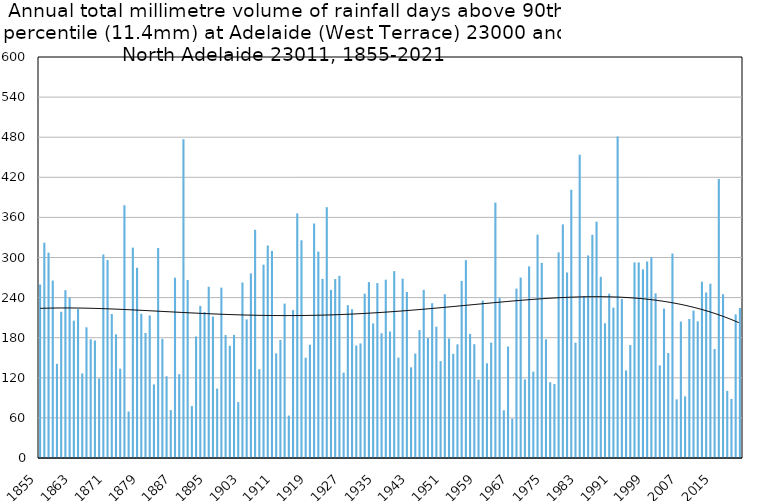
| Category | Annual total mm in days above 90th percentile |
|---|---|
| 1855 | 259.6 |
| 1856 | 322.1 |
| 1857 | 307.2 |
| 1858 | 265.5 |
| 1859 | 140.9 |
| 1860 | 218.8 |
| 1861 | 251.1 |
| 1862 | 240.2 |
| 1863 | 205.4 |
| 1864 | 222.8 |
| 1865 | 126.5 |
| 1866 | 195.6 |
| 1867 | 177.7 |
| 1868 | 175.8 |
| 1869 | 118.9 |
| 1870 | 304.5 |
| 1871 | 296.2 |
| 1872 | 215.5 |
| 1873 | 185 |
| 1874 | 133.7 |
| 1875 | 378.2 |
| 1876 | 69.6 |
| 1877 | 314.8 |
| 1878 | 284.6 |
| 1879 | 215.8 |
| 1880 | 187.1 |
| 1881 | 213.3 |
| 1882 | 110.1 |
| 1883 | 314.3 |
| 1884 | 178.3 |
| 1885 | 122.3 |
| 1886 | 71.6 |
| 1887 | 269.8 |
| 1888 | 125.4 |
| 1889 | 477 |
| 1890 | 266.3 |
| 1891 | 77.7 |
| 1892 | 181.9 |
| 1893 | 227.6 |
| 1894 | 218.4 |
| 1895 | 256.2 |
| 1896 | 211.6 |
| 1897 | 103.9 |
| 1898 | 254.9 |
| 1899 | 183.9 |
| 1900 | 167.9 |
| 1901 | 184.2 |
| 1902 | 83.6 |
| 1903 | 262.6 |
| 1904 | 207.3 |
| 1905 | 276.2 |
| 1906 | 341.5 |
| 1907 | 132.9 |
| 1908 | 289.3 |
| 1909 | 318 |
| 1910 | 309.9 |
| 1911 | 156.6 |
| 1912 | 176.7 |
| 1913 | 231 |
| 1914 | 63.5 |
| 1915 | 221.3 |
| 1916 | 366 |
| 1917 | 325.8 |
| 1918 | 150.1 |
| 1919 | 169.4 |
| 1920 | 350.8 |
| 1921 | 308.9 |
| 1922 | 268 |
| 1923 | 375.3 |
| 1924 | 251.5 |
| 1925 | 267.7 |
| 1926 | 272.6 |
| 1927 | 127.7 |
| 1928 | 228.6 |
| 1929 | 222.6 |
| 1930 | 168.4 |
| 1931 | 171.4 |
| 1932 | 245.9 |
| 1933 | 263.2 |
| 1934 | 201.4 |
| 1935 | 261.7 |
| 1936 | 186.7 |
| 1937 | 266.8 |
| 1938 | 189.3 |
| 1939 | 279.6 |
| 1940 | 150.3 |
| 1941 | 268.3 |
| 1942 | 248.3 |
| 1943 | 135.7 |
| 1944 | 156.2 |
| 1945 | 191.4 |
| 1946 | 251.6 |
| 1947 | 179.5 |
| 1948 | 231.6 |
| 1949 | 196.5 |
| 1950 | 145 |
| 1951 | 245.1 |
| 1952 | 178.8 |
| 1953 | 155.9 |
| 1954 | 170.1 |
| 1955 | 265 |
| 1956 | 296 |
| 1957 | 185.7 |
| 1958 | 170.3 |
| 1959 | 117.2 |
| 1960 | 235.7 |
| 1961 | 141.7 |
| 1962 | 172.7 |
| 1963 | 382.2 |
| 1964 | 239.8 |
| 1965 | 71.4 |
| 1966 | 166.8 |
| 1967 | 58.9 |
| 1968 | 253.5 |
| 1969 | 270 |
| 1970 | 117.6 |
| 1971 | 286.7 |
| 1972 | 129.3 |
| 1973 | 334.1 |
| 1974 | 292 |
| 1975 | 177.6 |
| 1976 | 113.4 |
| 1977 | 110.6 |
| 1978 | 307.6 |
| 1979 | 349.6 |
| 1980 | 277.6 |
| 1981 | 401.4 |
| 1982 | 172.6 |
| 1983 | 453.6 |
| 1984 | 242.4 |
| 1985 | 303.1 |
| 1986 | 334 |
| 1987 | 353.6 |
| 1988 | 271 |
| 1989 | 201.6 |
| 1990 | 245.9 |
| 1991 | 225 |
| 1992 | 481 |
| 1993 | 237.8 |
| 1994 | 131.1 |
| 1995 | 169 |
| 1996 | 292.6 |
| 1997 | 292.6 |
| 1998 | 282.2 |
| 1999 | 294 |
| 2000 | 300.6 |
| 2001 | 246.3 |
| 2002 | 138.6 |
| 2003 | 223.6 |
| 2004 | 157 |
| 2005 | 306 |
| 2006 | 87.8 |
| 2007 | 204.2 |
| 2008 | 92.2 |
| 2009 | 208 |
| 2010 | 220.6 |
| 2011 | 204.6 |
| 2012 | 263.8 |
| 2013 | 247.6 |
| 2014 | 260.8 |
| 2015 | 163 |
| 2016 | 417.6 |
| 2017 | 245 |
| 2018 | 100.4 |
| 2019 | 88.4 |
| 2020 | 214.8 |
| 2021 | 224.4 |